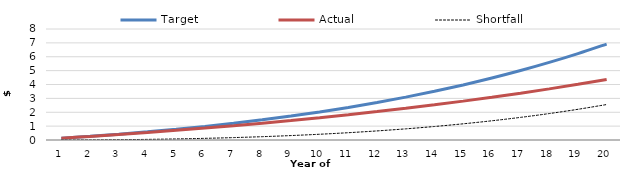
| Category | Target | Actual | Shortfall |
|---|---|---|---|
| 0 | 125000 | 125000 | 0 |
| 1 | 263750 | 256875 | 6875 |
| 2 | 417384.375 | 396003.125 | 21381.25 |
| 3 | 587120.687 | 542783.297 | 44337.391 |
| 4 | 774265.407 | 697636.378 | 76629.028 |
| 5 | 980220.005 | 861006.379 | 119213.626 |
| 6 | 1206487.456 | 1033361.73 | 173125.726 |
| 7 | 1454679.161 | 1215196.625 | 239482.536 |
| 8 | 1726522.329 | 1407032.439 | 319489.89 |
| 9 | 2023867.842 | 1609419.224 | 414448.618 |
| 10 | 2348698.63 | 1822937.281 | 525761.349 |
| 11 | 2703138.605 | 2048198.831 | 654939.774 |
| 12 | 3089462.164 | 2285849.767 | 803612.397 |
| 13 | 3510104.321 | 2536571.504 | 973532.816 |
| 14 | 3967671.491 | 2801082.937 | 1166588.554 |
| 15 | 4464952.984 | 3080142.498 | 1384810.486 |
| 16 | 5004933.236 | 3374550.336 | 1630382.9 |
| 17 | 5590804.832 | 3685150.604 | 1905654.228 |
| 18 | 6225982.382 | 4012833.888 | 2213148.494 |
| 19 | 6914117.276 | 4358539.751 | 2555577.525 |